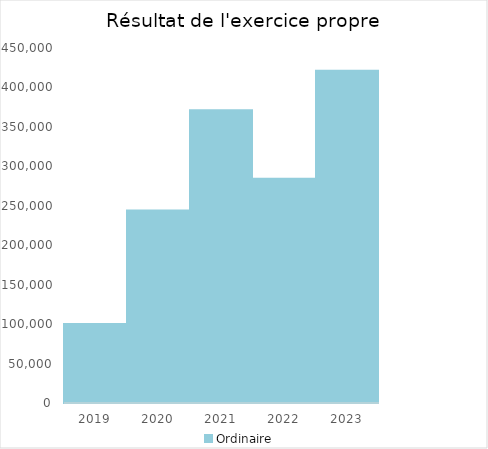
| Category |   | Ordinaire |    |
|---|---|---|---|
| 2019.0 |  | 100047.75 |  |
| 2020.0 |  | 244063.52 |  |
| 2021.0 |  | 370992.32 |  |
| 2022.0 |  | 284257.43 |  |
| 2023.0 |  | 421181.22 |  |